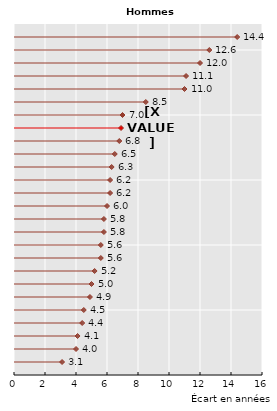
| Category | Series 0 |
|---|---|
| 3.1000000000000014 | 1 |
| 0.0 | 1 |
| 4.0 | 2 |
| 0.0 | 2 |
| 4.099999999999994 | 3 |
| 0.0 | 3 |
| 4.399999999999999 | 4 |
| 0.0 | 4 |
| 4.5 | 5 |
| 0.0 | 5 |
| 4.900000000000006 | 6 |
| 0.0 | 6 |
| 5.0 | 7 |
| 0.0 | 7 |
| 5.199999999999996 | 8 |
| 0.0 | 8 |
| 5.599999999999994 | 9 |
| 0.0 | 9 |
| 5.600000000000001 | 10 |
| 0.0 | 10 |
| 5.799999999999997 | 11 |
| 0.0 | 11 |
| 5.799999999999997 | 12 |
| 0.0 | 12 |
| 6.0 | 13 |
| 0.0 | 13 |
| 6.199999999999996 | 14 |
| 0.0 | 14 |
| 6.199999999999996 | 15 |
| 0.0 | 15 |
| 6.299999999999997 | 16 |
| 0.0 | 16 |
| 6.5 | 17 |
| 0.0 | 17 |
| 6.792307692307691 | 18 |
| 0.0 | 18 |
| 6.903692307692307 | 19 |
| 0.0 | 19 |
| 7.0 | 20 |
| 0.0 | 20 |
| 8.5 | 21 |
| 0.0 | 21 |
| 11.0 | 22 |
| 0.0 | 22 |
| 11.099999999999994 | 23 |
| 0.0 | 23 |
| 12.0 | 24 |
| 0.0 | 24 |
| 12.600000000000001 | 25 |
| 0.0 | 25 |
| 14.399999999999999 | 26 |
| 0.0 | 26 |